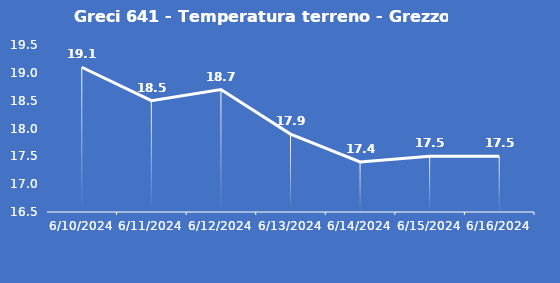
| Category | Greci 641 - Temperatura terreno - Grezzo (°C) |
|---|---|
| 6/10/24 | 19.1 |
| 6/11/24 | 18.5 |
| 6/12/24 | 18.7 |
| 6/13/24 | 17.9 |
| 6/14/24 | 17.4 |
| 6/15/24 | 17.5 |
| 6/16/24 | 17.5 |